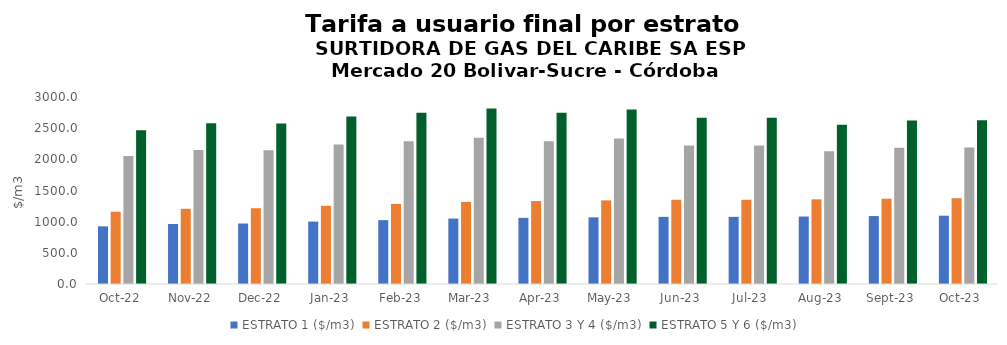
| Category | ESTRATO 1 ($/m3) | ESTRATO 2 ($/m3) | ESTRATO 3 Y 4 ($/m3) | ESTRATO 5 Y 6 ($/m3) |
|---|---|---|---|---|
| 2022-10-01 | 924.96 | 1159.68 | 2054.17 | 2465.004 |
| 2022-11-01 | 962.82 | 1206.32 | 2147.73 | 2577.276 |
| 2022-12-01 | 970.22 | 1215.6 | 2146.46 | 2575.752 |
| 2023-01-01 | 1001.38 | 1254.3 | 2238.4 | 2686.08 |
| 2023-02-01 | 1024.53 | 1284.4 | 2288.91 | 2746.692 |
| 2023-03-01 | 1049.77 | 1317.27 | 2345.6 | 2814.72 |
| 2023-04-01 | 1060.8 | 1331.1 | 2289.32 | 2747.184 |
| 2023-05-01 | 1069.09 | 1341.51 | 2332.27 | 2798.724 |
| 2023-06-01 | 1076.98 | 1351.41 | 2221.89 | 2666.268 |
| 2023-07-01 | 1076.98 | 1351.41 | 2221.89 | 2666.268 |
| 2023-08-01 | 1082.37 | 1358.18 | 2129.89 | 2555.868 |
| 2023-09-01 | 1089.94 | 1367.67 | 2187.17 | 2624.604 |
| 2023-10-01 | 1095.74 | 1374.95 | 2190.44 | 2628.528 |